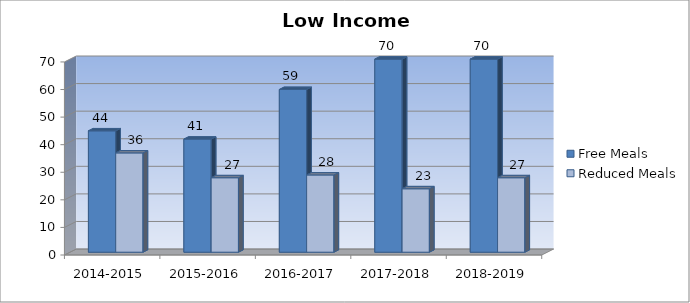
| Category | Free Meals | Reduced Meals |
|---|---|---|
| 2014-2015 | 44 | 36 |
| 2015-2016 | 41 | 27 |
| 2016-2017 | 59 | 28 |
| 2017-2018 | 70 | 23 |
| 2018-2019 | 70 | 27 |